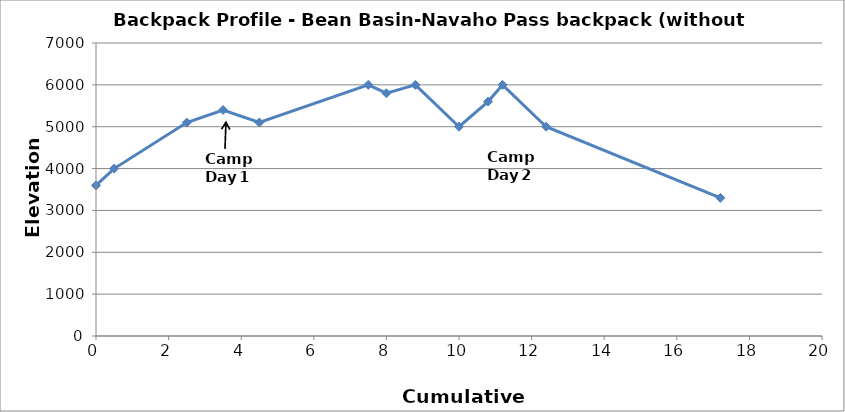
| Category | Series 0 |
|---|---|
| 0.0 | 3600 |
| 0.5 | 4000 |
| 2.5 | 5100 |
| 3.5 | 5400 |
| 4.5 | 5100 |
| 7.5 | 6000 |
| 8.0 | 5800 |
| 8.8 | 6000 |
| 10.0 | 5000 |
| 10.8 | 5600 |
| 11.200000000000001 | 6000 |
| 12.4 | 5000 |
| 17.2 | 3300 |